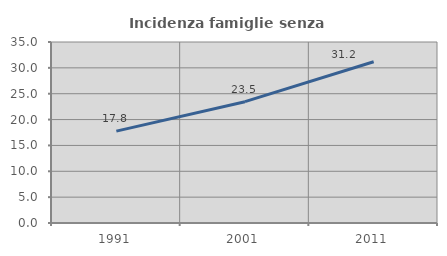
| Category | Incidenza famiglie senza nuclei |
|---|---|
| 1991.0 | 17.77 |
| 2001.0 | 23.46 |
| 2011.0 | 31.191 |